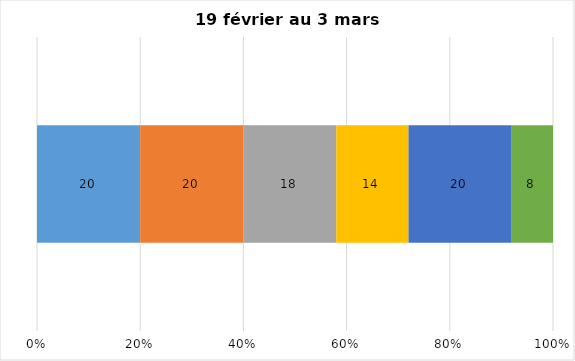
| Category | Plusieurs fois par jour | Une fois par jour | Quelques fois par semaine   | Une fois par semaine ou moins   |  Jamais   |  Je n’utilise pas les médias sociaux |
|---|---|---|---|---|---|---|
| 0 | 20 | 20 | 18 | 14 | 20 | 8 |